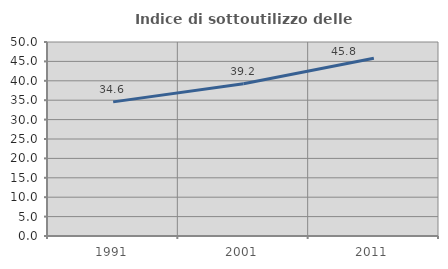
| Category | Indice di sottoutilizzo delle abitazioni  |
|---|---|
| 1991.0 | 34.568 |
| 2001.0 | 39.227 |
| 2011.0 | 45.821 |